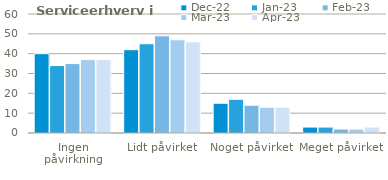
| Category | dec-22 | jan-23 | feb-23 | mar-23 | apr-23 |
|---|---|---|---|---|---|
| Ingen påvirkning | 40 | 34 | 35 | 37 | 37 |
| Lidt påvirket | 42 | 45 | 49 | 47 | 46 |
| Noget påvirket | 15 | 17 | 14 | 13 | 13 |
| Meget påvirket | 3 | 3 | 2 | 2 | 3 |